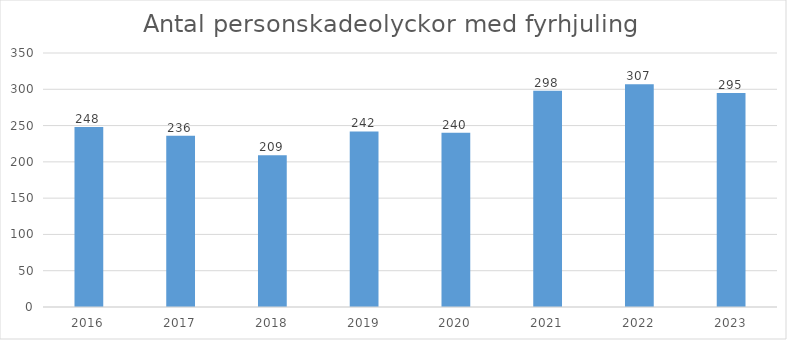
| Category | Total |
|---|---|
| 2016.0 | 248 |
| 2017.0 | 236 |
| 2018.0 | 209 |
| 2019.0 | 242 |
| 2020.0 | 240 |
| 2021.0 | 298 |
| 2022.0 | 307 |
| 2023.0 | 295 |